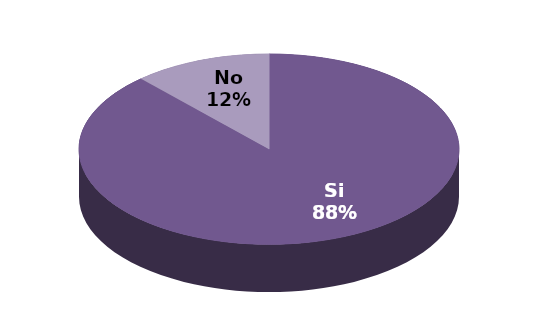
| Category | Series 1 |
|---|---|
| Si | 30 |
| No | 4 |